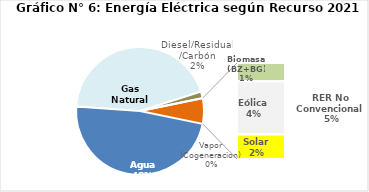
| Category | Series 0 |
|---|---|
| Agua | 2346.115 |
| Gas Natural | 2151.088 |
| Diesel/Residual/Carbón | 81.49 |
| Vapor (Cogeneracion) | 1.89 |
| Biomasa (BZ+BG) | 60.296 |
| Eólica | 174.61 |
| Solar | 80.871 |